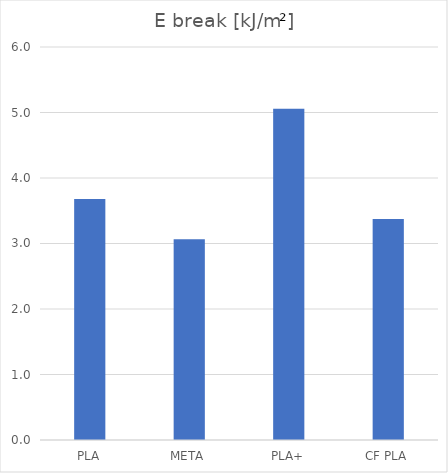
| Category | kJ/m² |
|---|---|
| PLA | 3.679 |
| META | 3.066 |
| PLA+ | 5.058 |
| CF PLA | 3.372 |